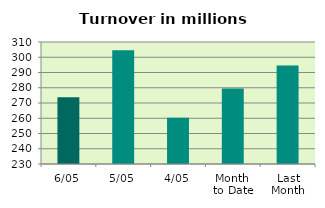
| Category | Series 0 |
|---|---|
| 6/05 | 273.79 |
| 5/05 | 304.587 |
| 4/05 | 260.251 |
| Month 
to Date | 279.543 |
| Last
Month | 294.539 |